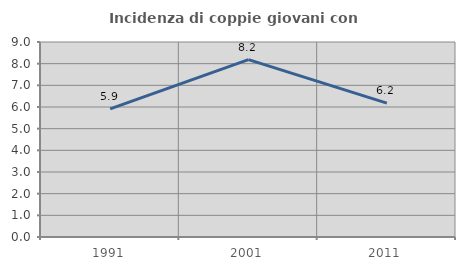
| Category | Incidenza di coppie giovani con figli |
|---|---|
| 1991.0 | 5.914 |
| 2001.0 | 8.187 |
| 2011.0 | 6.18 |